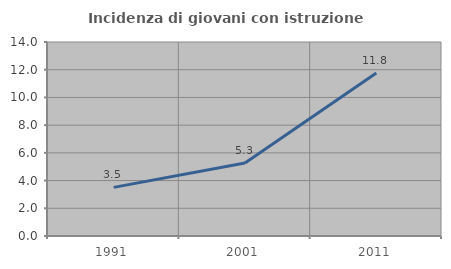
| Category | Incidenza di giovani con istruzione universitaria |
|---|---|
| 1991.0 | 3.509 |
| 2001.0 | 5.263 |
| 2011.0 | 11.765 |